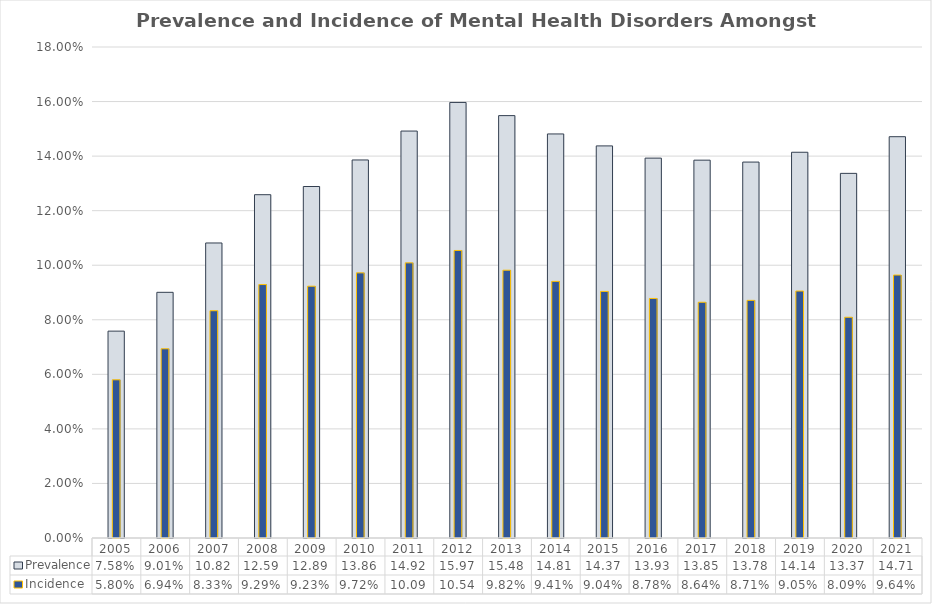
| Category | Prevalence |
|---|---|
| 2005.0 | 0.076 |
| 2006.0 | 0.09 |
| 2007.0 | 0.108 |
| 2008.0 | 0.126 |
| 2009.0 | 0.129 |
| 2010.0 | 0.139 |
| 2011.0 | 0.149 |
| 2012.0 | 0.16 |
| 2013.0 | 0.155 |
| 2014.0 | 0.148 |
| 2015.0 | 0.144 |
| 2016.0 | 0.139 |
| 2017.0 | 0.139 |
| 2018.0 | 0.138 |
| 2019.0 | 0.141 |
| 2020.0 | 0.134 |
| 2021.0 | 0.147 |